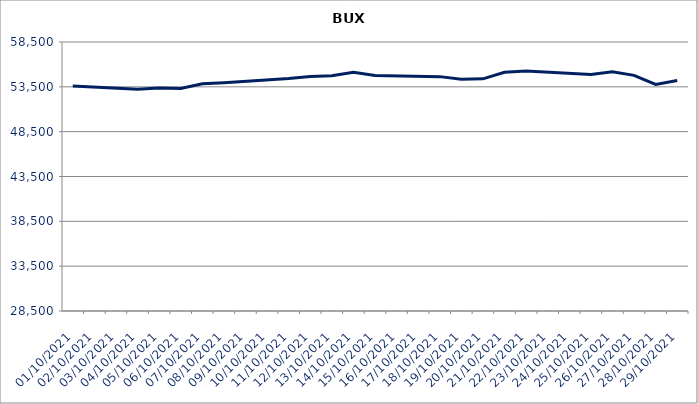
| Category | BUX |
|---|---|
| 01/10/2021 | 53589.8 |
| 04/10/2021 | 53234.94 |
| 05/10/2021 | 53369.78 |
| 06/10/2021 | 53305.16 |
| 07/10/2021 | 53844.59 |
| 08/10/2021 | 53955.85 |
| 11/10/2021 | 54432.56 |
| 12/10/2021 | 54648.43 |
| 13/10/2021 | 54733.73 |
| 14/10/2021 | 55136 |
| 15/10/2021 | 54764.34 |
| 18/10/2021 | 54637.92 |
| 19/10/2021 | 54356.89 |
| 20/10/2021 | 54393.63 |
| 21/10/2021 | 55121.35 |
| 22/10/2021 | 55254.39 |
| 25/10/2021 | 54867.62 |
| 26/10/2021 | 55191.91 |
| 27/10/2021 | 54780.65 |
| 28/10/2021 | 53766.44 |
| 29/10/2021 | 54197.71 |